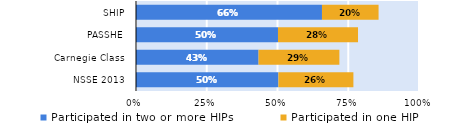
| Category | Participated in two or more HIPs | Participated in one HIP |
|---|---|---|
| NSSE 2013 | 0.503 | 0.265 |
| Carnegie Class | 0.433 | 0.286 |
| PASSHE | 0.502 | 0.283 |
| SHIP | 0.657 | 0.2 |